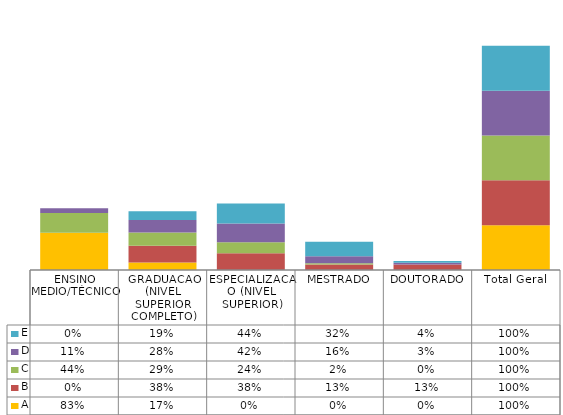
| Category | A | B | C | D | E |
|---|---|---|---|---|---|
| ENSINO MEDIO/TÉCNICO | 0.833 | 0 | 0.439 | 0.106 | 0 |
| GRADUACAO (NIVEL SUPERIOR COMPLETO) | 0.167 | 0.375 | 0.293 | 0.283 | 0.193 |
| ESPECIALIZACAO (NIVEL SUPERIOR) | 0 | 0.375 | 0.244 | 0.421 | 0.441 |
| MESTRADO | 0 | 0.125 | 0.024 | 0.155 | 0.323 |
| DOUTORADO | 0 | 0.125 | 0 | 0.035 | 0.043 |
| Total Geral | 1 | 1 | 1 | 1 | 1 |